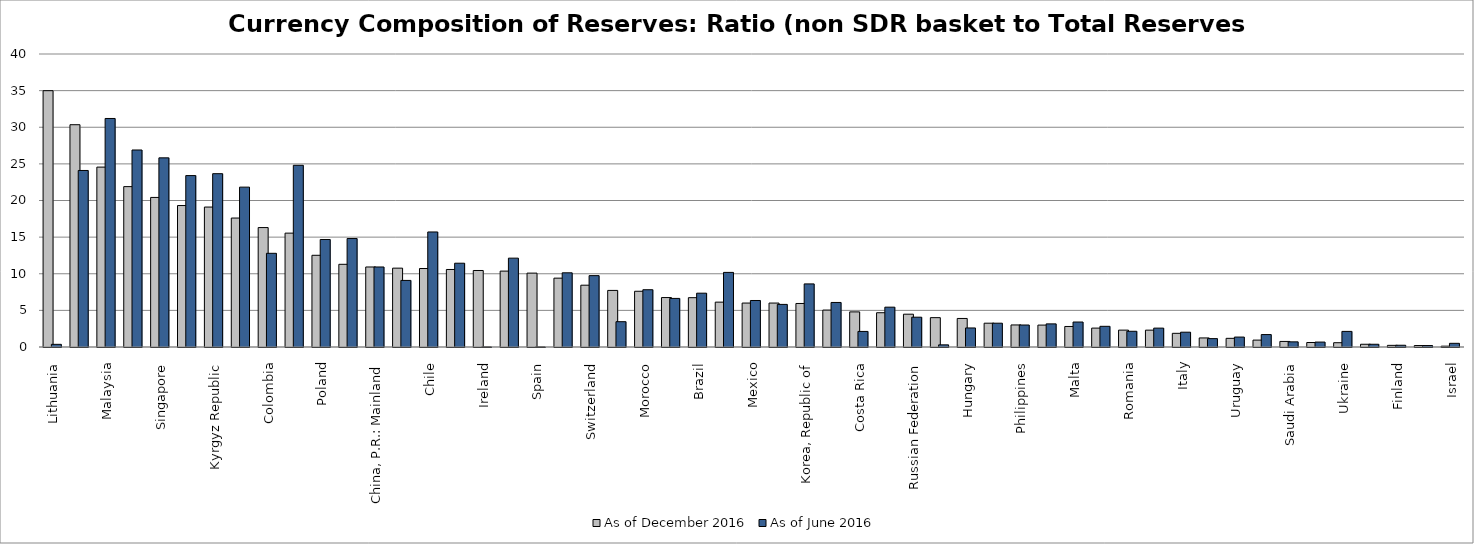
| Category | As of December 2016 | As of June 2016 |
|---|---|---|
| Lithuania | 34.992 | 0.365 |
| Estonia | 30.346 | 24.099 |
| Malaysia | 24.559 | 31.198 |
| Czech Republic | 21.896 | 26.896 |
| Singapore | 20.418 | 25.822 |
| Austria | 19.312 | 23.402 |
| Kyrgyz Republic | 19.106 | 23.661 |
| Mauritius | 17.605 | 21.825 |
| Colombia | 16.304 | 12.79 |
| Indonesia | 15.544 | 24.807 |
| Poland | 12.521 | 14.677 |
| Thailand | 11.29 | 14.808 |
| China, P.R.: Mainland | 10.925 | 10.925 |
| Bolivia | 10.766 | 9.091 |
| Chile | 10.716 | 15.705 |
| South Africa | 10.584 | 11.438 |
| Ireland | 10.445 | 0.007 |
| Georgia | 10.362 | 12.13 |
| Spain | 10.087 | 0.004 |
| India | 9.4 | 10.13 |
| Switzerland | 8.438 | 9.742 |
| Norway | 7.726 | 3.454 |
| Morocco | 7.611 | 7.82 |
| Sweden | 6.75 | 6.634 |
| Brazil | 6.732 | 7.347 |
| Australia | 6.126 | 10.185 |
| Mexico | 5.999 | 6.349 |
| New Zealand | 5.999 | 5.817 |
| Korea, Republic of | 5.943 | 8.613 |
| Latvia | 5.039 | 6.081 |
| Costa Rica | 4.795 | 2.126 |
| France | 4.679 | 5.438 |
| Russian Federation | 4.479 | 4.068 |
| United Kingdom | 4.006 | 0.292 |
| Hungary | 3.896 | 2.6 |
| China, P.R.: Hong Kong | 3.251 | 3.251 |
| Philippines | 3.012 | 3.003 |
| Jamaica | 2.991 | 3.157 |
| Malta | 2.802 | 3.409 |
| Euro Area | 2.579 | 2.823 |
| Romania | 2.305 | 2.148 |
| Kazakhstan | 2.301 | 2.579 |
| Italy | 1.867 | 2.021 |
| Turkey | 1.239 | 1.145 |
| Uruguay | 1.183 | 1.356 |
| Denmark | 0.941 | 1.696 |
| Saudi Arabia | 0.759 | 0.704 |
| Germany | 0.613 | 0.673 |
| Ukraine | 0.585 | 2.13 |
| Tunisia | 0.374 | 0.374 |
| Finland | 0.225 | 0.241 |
| Egypt | 0.2 | 0.2 |
| Israel | 0.114 | 0.502 |